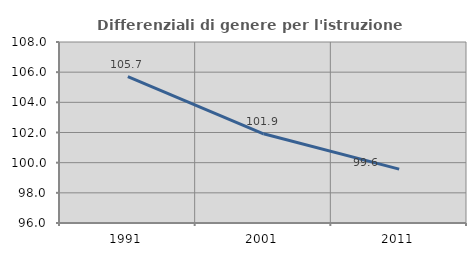
| Category | Differenziali di genere per l'istruzione superiore |
|---|---|
| 1991.0 | 105.708 |
| 2001.0 | 101.913 |
| 2011.0 | 99.573 |